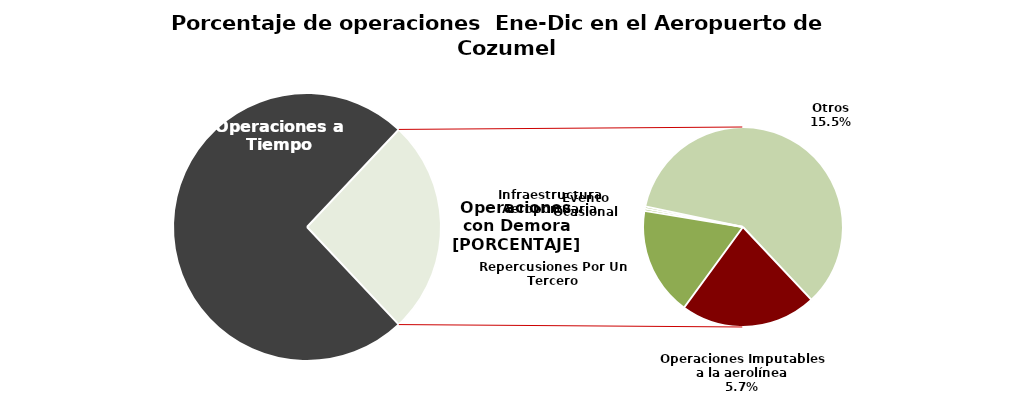
| Category | Series 0 |
|---|---|
| Operaciones a Tiempo | 3154 |
| Operaciones Imputables a la aerolínea | 244 |
| Repercusiones Por Un Tercero | 194 |
| Evento Ocasional | 4 |
| Infraestructura Aeroportuaria | 4 |
| Otros | 660 |